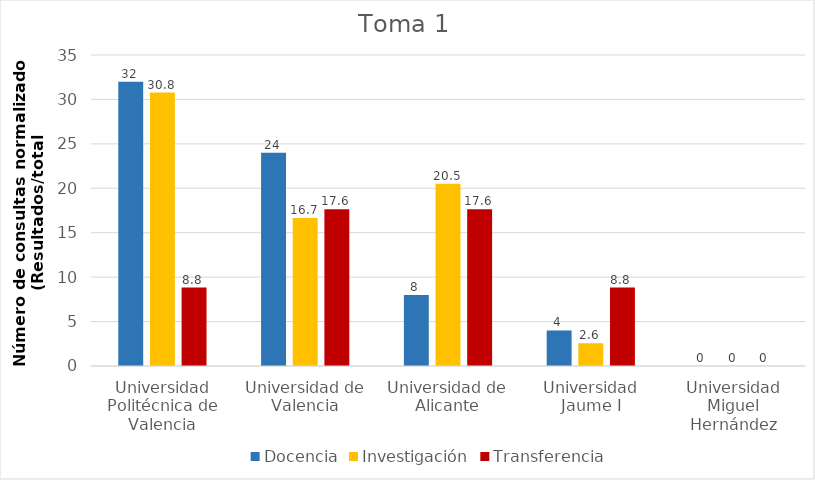
| Category | Docencia | Investigación | Transferencia |
|---|---|---|---|
| Universidad Politécnica de Valencia | 32 | 30.769 | 8.824 |
| Universidad de Valencia | 24 | 16.667 | 17.647 |
| Universidad de Alicante | 8 | 20.513 | 17.647 |
| Universidad Jaume I | 4 | 2.564 | 8.824 |
| Universidad Miguel Hernández | 0 | 0 | 0 |